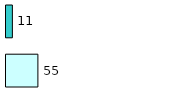
| Category | Series 0 | Series 1 |
|---|---|---|
| 0 | 55 | 11 |